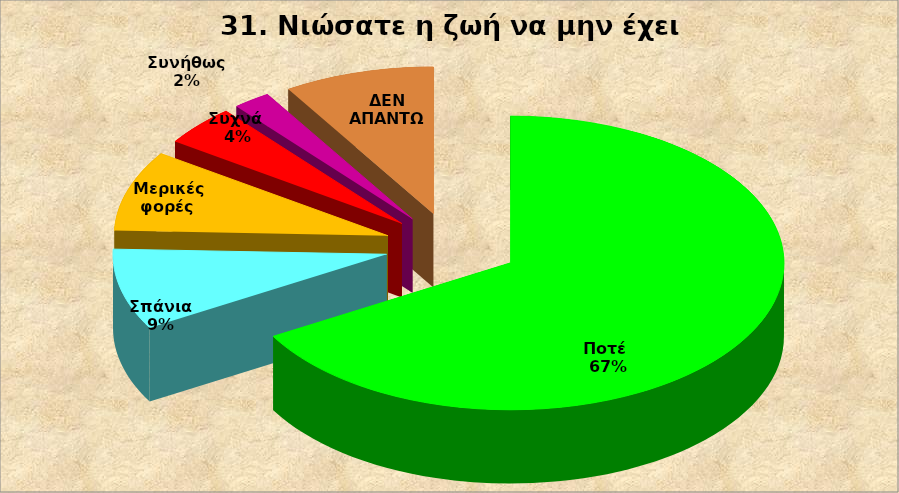
| Category | Series 0 |
|---|---|
| Ποτέ  | 30 |
| Σπάνια  | 4 |
| Μερικές φορές  | 4 |
| Συχνά  | 2 |
| Συνήθως  | 1 |
| ΔΕΝ ΑΠΑΝΤΩ | 4 |